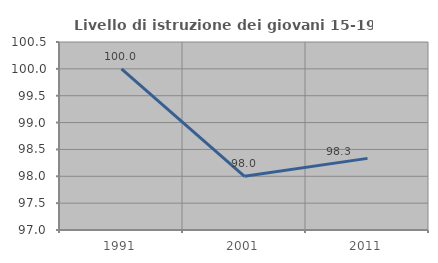
| Category | Livello di istruzione dei giovani 15-19 anni |
|---|---|
| 1991.0 | 100 |
| 2001.0 | 98 |
| 2011.0 | 98.333 |